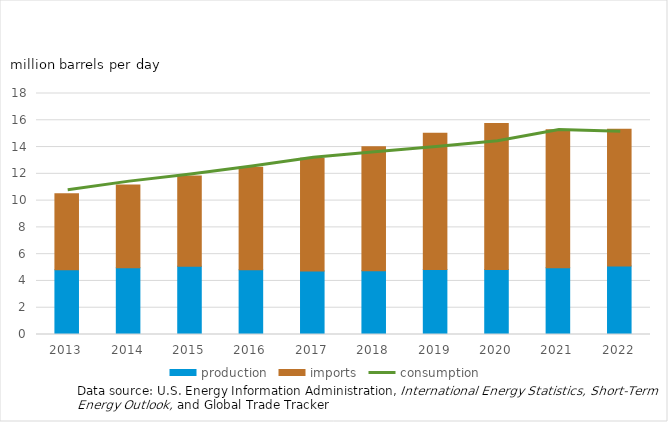
| Category | production | imports |
|---|---|---|
| 2013.0 | 4.841 | 5.666 |
| 2014.0 | 4.983 | 6.192 |
| 2015.0 | 5.103 | 6.737 |
| 2016.0 | 4.838 | 7.652 |
| 2017.0 | 4.738 | 8.434 |
| 2018.0 | 4.753 | 9.278 |
| 2019.0 | 4.863 | 10.159 |
| 2020.0 | 4.863 | 10.893 |
| 2021.0 | 4.993 | 10.307 |
| 2022.0 | 5.119 | 10.21 |